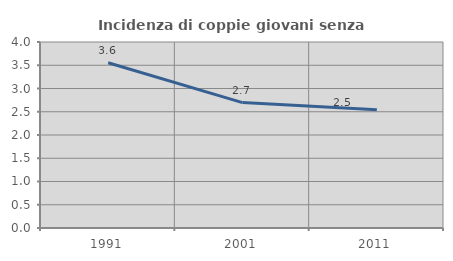
| Category | Incidenza di coppie giovani senza figli |
|---|---|
| 1991.0 | 3.555 |
| 2001.0 | 2.697 |
| 2011.0 | 2.542 |